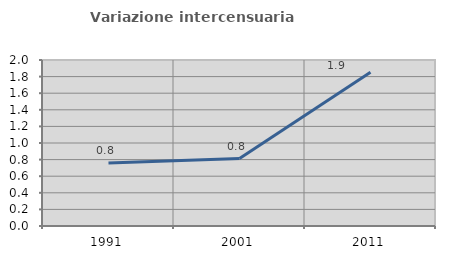
| Category | Variazione intercensuaria annua |
|---|---|
| 1991.0 | 0.758 |
| 2001.0 | 0.813 |
| 2011.0 | 1.852 |